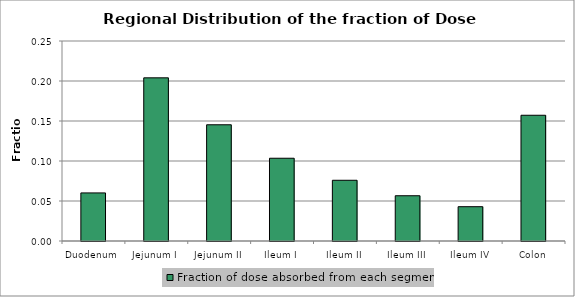
| Category | Fraction of dose absorbed from each segment |
|---|---|
| Duodenum | 0.06 |
| Jejunum I | 0.204 |
| Jejunum II | 0.145 |
| Ileum I | 0.103 |
| Ileum II | 0.076 |
| Ileum III | 0.057 |
| Ileum IV | 0.043 |
| Colon | 0.157 |